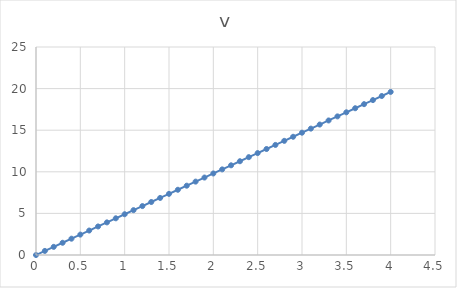
| Category | v |
|---|---|
| 0.0 | 0 |
| 0.1 | 0.49 |
| 0.2 | 0.98 |
| 0.3 | 1.47 |
| 0.4 | 1.96 |
| 0.5 | 2.45 |
| 0.6 | 2.94 |
| 0.7 | 3.43 |
| 0.8 | 3.92 |
| 0.9 | 4.41 |
| 1.0 | 4.9 |
| 1.1 | 5.39 |
| 1.2 | 5.88 |
| 1.3 | 6.37 |
| 1.4 | 6.86 |
| 1.5 | 7.35 |
| 1.6 | 7.84 |
| 1.7 | 8.33 |
| 1.8 | 8.82 |
| 1.9 | 9.31 |
| 2.0 | 9.8 |
| 2.1 | 10.29 |
| 2.2 | 10.78 |
| 2.3 | 11.27 |
| 2.4 | 11.76 |
| 2.5 | 12.25 |
| 2.6 | 12.74 |
| 2.7 | 13.23 |
| 2.8 | 13.72 |
| 2.9 | 14.21 |
| 3.0 | 14.7 |
| 3.1 | 15.19 |
| 3.2 | 15.68 |
| 3.3 | 16.17 |
| 3.4 | 16.66 |
| 3.5 | 17.15 |
| 3.6 | 17.64 |
| 3.7 | 18.13 |
| 3.8 | 18.62 |
| 3.9 | 19.11 |
| 4.0 | 19.6 |